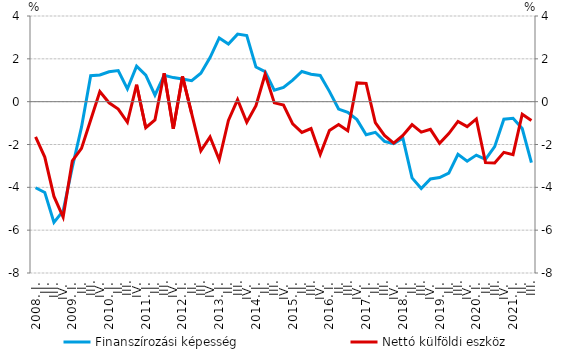
| Category | Finanszírozási képesség |
|---|---|
| 2008. I. | -4.019 |
| II. | -4.238 |
| III. | -5.639 |
| IV. | -5.103 |
| 2009. I. | -3.059 |
|          II. | -1.191 |
|          III. | 1.214 |
|          IV. | 1.244 |
| 2010. I. | 1.397 |
|          II. | 1.45 |
|          III. | 0.598 |
|          IV. | 1.654 |
| 2011. I. | 1.243 |
|          II. | 0.303 |
|          III. | 1.235 |
|          IV. | 1.124 |
| 2012. I. | 1.054 |
|          II. | 0.98 |
|          III. | 1.33 |
|          IV. | 2.057 |
| 2013. I. | 2.976 |
| II. | 2.693 |
|          III. | 3.153 |
| IV. | 3.089 |
| 2014. I. | 1.616 |
| II. | 1.403 |
|          III. | 0.531 |
| IV. | 0.666 |
| 2015. I. | 1.002 |
| II. | 1.41 |
|          III. | 1.282 |
| IV. | 1.226 |
| 2016. I. | 0.482 |
| II. | -0.345 |
|          III. | -0.501 |
| IV. | -0.838 |
| 2017. I. | -1.546 |
| II. | -1.431 |
|          III. | -1.854 |
| IV. | -1.963 |
| 2018. I. | -1.706 |
| II. | -3.56 |
|          III. | -4.054 |
| IV. | -3.607 |
| 2019. I. | -3.544 |
| II. | -3.333 |
|          III. | -2.457 |
| IV. | -2.78 |
| 2020. I. | -2.495 |
| II. | -2.693 |
|          III. | -2.101 |
| IV. | -0.818 |
| 2021. I. | -0.772 |
| II. | -1.254 |
|          III. | -2.848 |